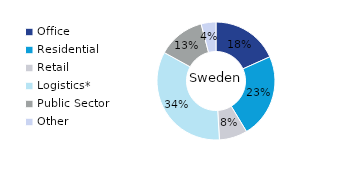
| Category | Sweden |
|---|---|
| Office | 0.183 |
| Residential | 0.231 |
| Retail | 0.077 |
| Logistics* | 0.339 |
| Public Sector | 0.129 |
| Other | 0.04 |